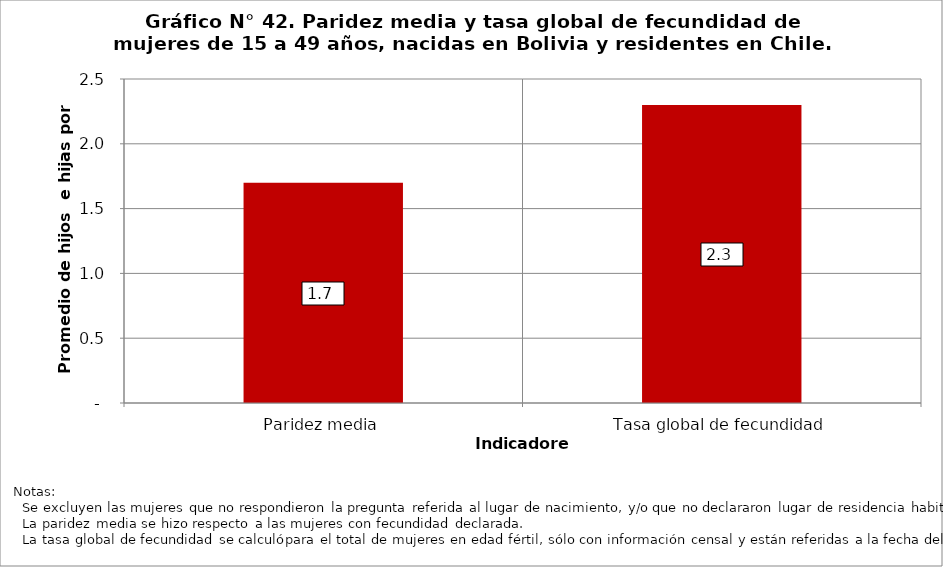
| Category | Bolivia |
|---|---|
| Paridez media | 1.7 |
| Tasa global de fecundidad | 2.3 |